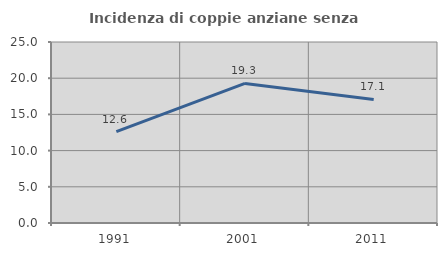
| Category | Incidenza di coppie anziane senza figli  |
|---|---|
| 1991.0 | 12.609 |
| 2001.0 | 19.277 |
| 2011.0 | 17.063 |